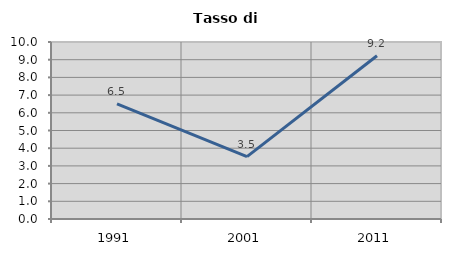
| Category | Tasso di disoccupazione   |
|---|---|
| 1991.0 | 6.5 |
| 2001.0 | 3.528 |
| 2011.0 | 9.221 |